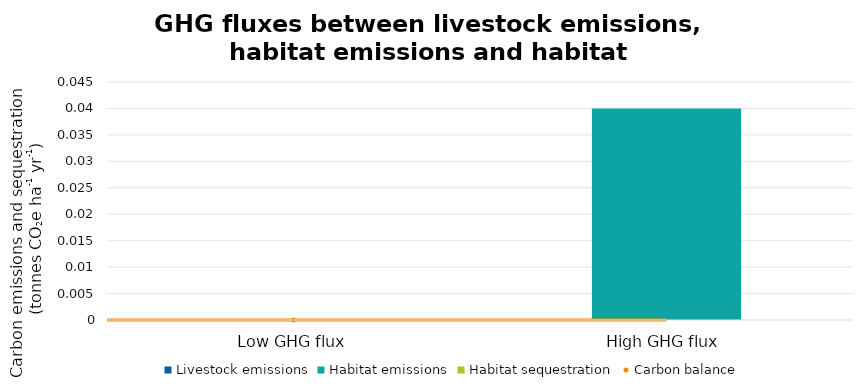
| Category | Livestock emissions | Habitat emissions | Habitat sequestration |
|---|---|---|---|
| Low GHG flux | 0 | 0 | 0 |
| High GHG flux | 0 | 0.04 | 0 |